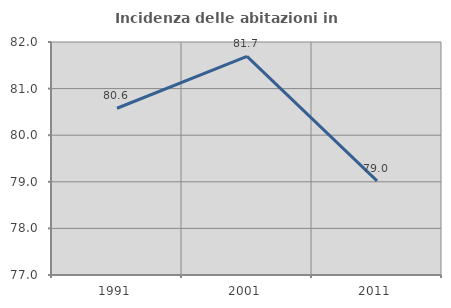
| Category | Incidenza delle abitazioni in proprietà  |
|---|---|
| 1991.0 | 80.578 |
| 2001.0 | 81.693 |
| 2011.0 | 79.021 |